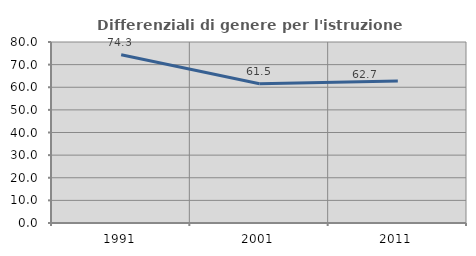
| Category | Differenziali di genere per l'istruzione superiore |
|---|---|
| 1991.0 | 74.33 |
| 2001.0 | 61.514 |
| 2011.0 | 62.725 |